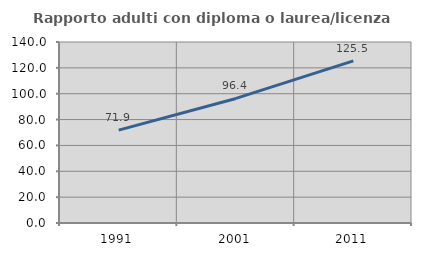
| Category | Rapporto adulti con diploma o laurea/licenza media  |
|---|---|
| 1991.0 | 71.875 |
| 2001.0 | 96.35 |
| 2011.0 | 125.455 |